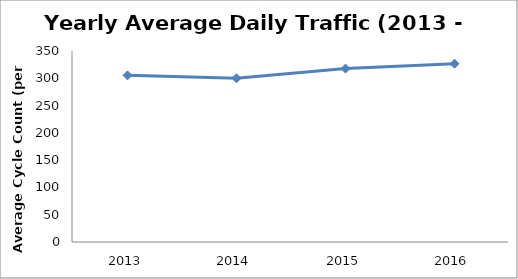
| Category | ADT |
|---|---|
| 2013.0 | 305.362 |
| 2014.0 | 300.014 |
| 2015.0 | 317.792 |
| 2016.0 | 326.656 |